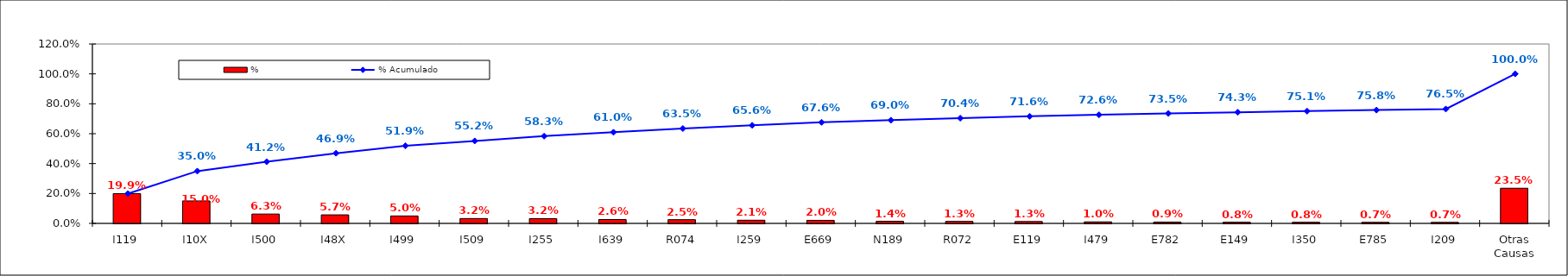
| Category | % |
|---|---|
| I119 | 0.199 |
| I10X | 0.15 |
| I500 | 0.063 |
| I48X | 0.057 |
| I499 | 0.05 |
| I509 | 0.032 |
| I255 | 0.032 |
| I639 | 0.026 |
| R074 | 0.025 |
| I259 | 0.021 |
| E669 | 0.02 |
| N189 | 0.014 |
| R072 | 0.013 |
| E119 | 0.013 |
| I479 | 0.01 |
| E782 | 0.009 |
| E149 | 0.008 |
| I350 | 0.008 |
| E785 | 0.007 |
| I209 | 0.007 |
| Otras Causas | 0.235 |